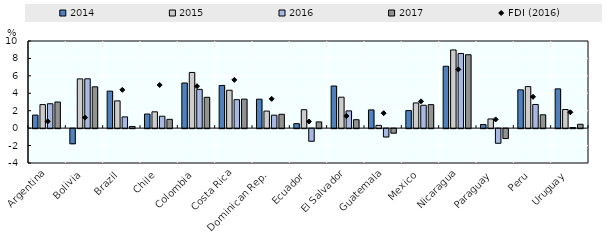
| Category | 2014 | 2015 | 2016 | 2017 |
|---|---|---|---|---|
| Argentina | 1.5 | 2.7 | 2.8 | 3 |
| Bolivia | -1.735 | 5.653 | 5.662 | 4.742 |
| Brazil | 4.249 | 3.13 | 1.293 | 0.191 |
| Chile | 1.617 | 1.873 | 1.368 | 1.011 |
| Colombia | 5.179 | 6.389 | 4.451 | 3.54 |
| Costa Rica | 4.897 | 4.347 | 3.269 | 3.33 |
| Dominican Rep. | 3.323 | 1.958 | 1.487 | 1.592 |
| Ecuador | 0.514 | 2.116 | -1.446 | 0.717 |
| El Salvador | 4.836 | 3.553 | 1.98 | 0.969 |
| Guatemala | 2.094 | 0.318 | -0.954 | -0.514 |
| Mexico | 2.017 | 2.892 | 2.627 | 2.697 |
| Nicaragua | 7.104 | 8.973 | 8.567 | 8.427 |
| Paraguay | 0.413 | 1.054 | -1.677 | -1.136 |
| Peru | 4.394 | 4.768 | 2.716 | 1.533 |
| Uruguay | 4.507 | 2.14 | 0.068 | 0.445 |